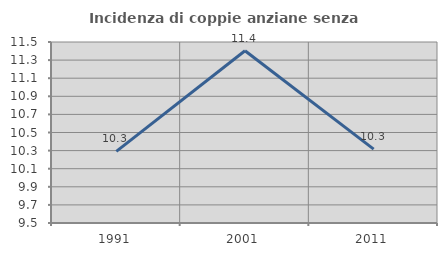
| Category | Incidenza di coppie anziane senza figli  |
|---|---|
| 1991.0 | 10.291 |
| 2001.0 | 11.404 |
| 2011.0 | 10.316 |